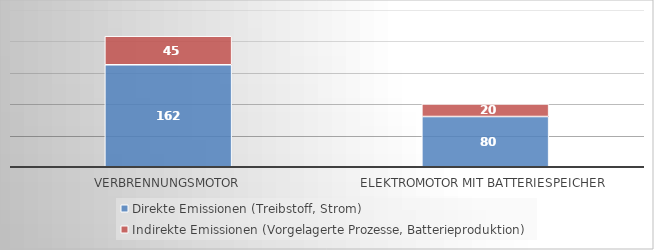
| Category | Direkte Emissionen (Treibstoff, Strom) | Indirekte Emissionen (Vorgelagerte Prozesse, Batterieproduktion) |
|---|---|---|
| Verbrennungsmotor | 162.4 | 45.472 |
| Elektromotor mit Batteriespeicher | 80 | 20 |